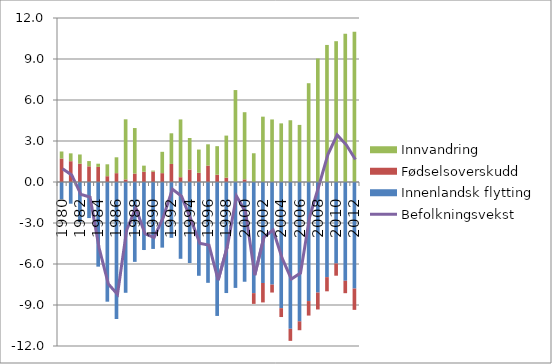
| Category | Innenlandsk flytting | Fødselsoverskudd | Innvandring |
|---|---|---|---|
| 1980.0 | -1.264 | 1.716 | 0.516 |
| 1981.0 | -1.587 | 1.523 | 0.574 |
| 1982.0 | -2.919 | 1.338 | 0.676 |
| 1983.0 | -2.638 | 1.146 | 0.386 |
| 1984.0 | -6.194 | 1.106 | 0.233 |
| 1985.0 | -8.758 | 0.425 | 0.871 |
| 1986.0 | -10.025 | 0.647 | 1.161 |
| 1987.0 | -8.106 | 0.188 | 4.4 |
| 1988.0 | -5.843 | 0.619 | 3.329 |
| 1989.0 | -4.978 | 0.75 | 0.447 |
| 1990.0 | -4.897 | 0.762 | 0.074 |
| 1991.0 | -4.802 | 0.647 | 1.561 |
| 1992.0 | -4.087 | 1.32 | 2.244 |
| 1993.0 | -5.619 | 0.351 | 4.228 |
| 1994.0 | -5.928 | 0.915 | 2.307 |
| 1995.0 | -6.862 | 0.674 | 1.699 |
| 1996.0 | -7.377 | 1.202 | 1.556 |
| 1997.0 | -9.801 | 0.531 | 2.091 |
| 1998.0 | -8.125 | 0.318 | 3.077 |
| 1999.0 | -7.748 | 0.026 | 6.701 |
| 2000.0 | -7.298 | 0.194 | 4.912 |
| 2001.0 | -8.131 | -0.786 | 2.103 |
| 2002.0 | -7.389 | -1.422 | 4.781 |
| 2003.0 | -7.508 | -0.58 | 4.577 |
| 2004.0 | -9.231 | -0.649 | 4.29 |
| 2005.0 | -10.742 | -0.882 | 4.518 |
| 2006.0 | -10.199 | -0.647 | 4.178 |
| 2007.0 | -8.711 | -1.062 | 7.228 |
| 2008.0 | -8.089 | -1.238 | 9.038 |
| 2009.0 | -6.961 | -1.037 | 10.028 |
| 2010.0 | -5.962 | -0.894 | 10.302 |
| 2011.0 | -7.227 | -0.909 | 10.855 |
| 2012.0 | -7.796 | -1.56 | 11.003 |